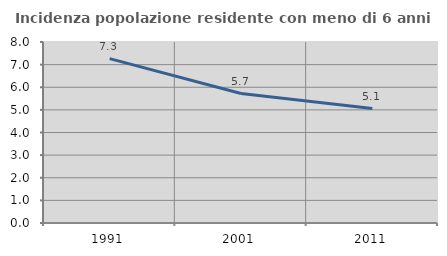
| Category | Incidenza popolazione residente con meno di 6 anni |
|---|---|
| 1991.0 | 7.264 |
| 2001.0 | 5.724 |
| 2011.0 | 5.059 |